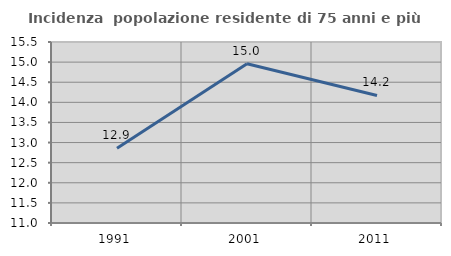
| Category | Incidenza  popolazione residente di 75 anni e più |
|---|---|
| 1991.0 | 12.86 |
| 2001.0 | 14.959 |
| 2011.0 | 14.171 |